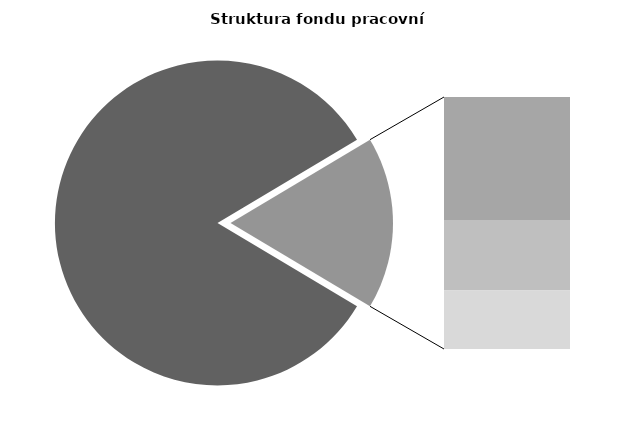
| Category | Series 0 |
|---|---|
| Průměrná měsíční odpracovaná doba bez přesčasu | 141.042 |
| Dovolená | 14.252 |
| Nemoc | 8.141 |
| Jiné | 6.78 |